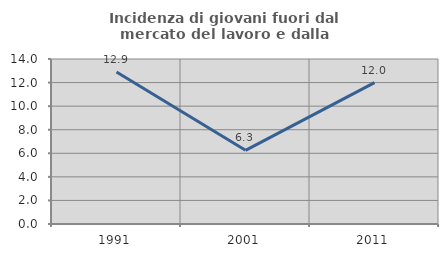
| Category | Incidenza di giovani fuori dal mercato del lavoro e dalla formazione  |
|---|---|
| 1991.0 | 12.903 |
| 2001.0 | 6.25 |
| 2011.0 | 12 |